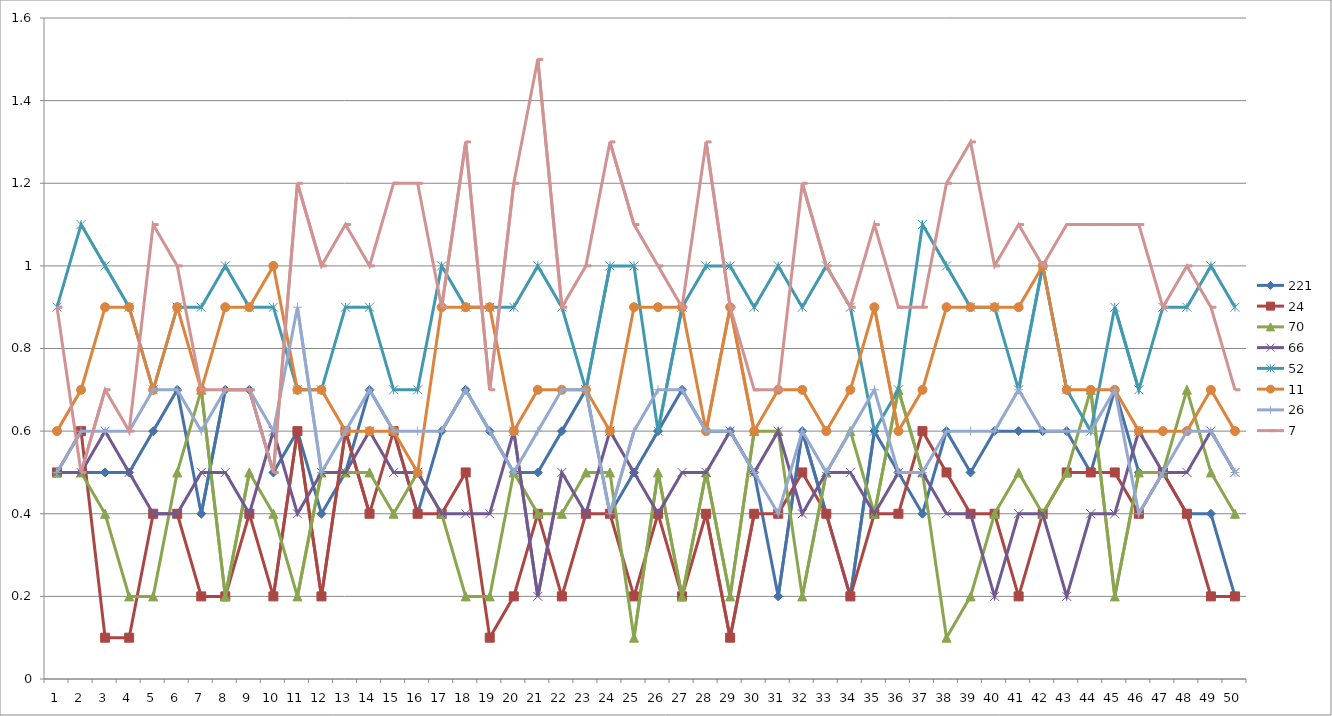
| Category | 221 | 24 | 70 | 66 | 52 | 11 | 26 | 7 |
|---|---|---|---|---|---|---|---|---|
| 0 | 0.5 | 0.5 | 0.5 | 0.5 | 0.9 | 0.6 | 0.5 | 0.9 |
| 1 | 0.5 | 0.6 | 0.5 | 0.5 | 1.1 | 0.7 | 0.6 | 0.5 |
| 2 | 0.5 | 0.1 | 0.4 | 0.6 | 1 | 0.9 | 0.6 | 0.7 |
| 3 | 0.5 | 0.1 | 0.2 | 0.5 | 0.9 | 0.9 | 0.6 | 0.6 |
| 4 | 0.6 | 0.4 | 0.2 | 0.4 | 0.7 | 0.7 | 0.7 | 1.1 |
| 5 | 0.7 | 0.4 | 0.5 | 0.4 | 0.9 | 0.9 | 0.7 | 1 |
| 6 | 0.4 | 0.2 | 0.7 | 0.5 | 0.9 | 0.7 | 0.6 | 0.7 |
| 7 | 0.7 | 0.2 | 0.2 | 0.5 | 1 | 0.9 | 0.7 | 0.7 |
| 8 | 0.7 | 0.4 | 0.5 | 0.4 | 0.9 | 0.9 | 0.7 | 0.7 |
| 9 | 0.5 | 0.2 | 0.4 | 0.6 | 0.9 | 1 | 0.6 | 0.5 |
| 10 | 0.6 | 0.6 | 0.2 | 0.4 | 0.7 | 0.7 | 0.9 | 1.2 |
| 11 | 0.4 | 0.2 | 0.5 | 0.5 | 0.7 | 0.7 | 0.5 | 1 |
| 12 | 0.5 | 0.6 | 0.5 | 0.5 | 0.9 | 0.6 | 0.6 | 1.1 |
| 13 | 0.7 | 0.4 | 0.5 | 0.6 | 0.9 | 0.6 | 0.7 | 1 |
| 14 | 0.6 | 0.6 | 0.4 | 0.5 | 0.7 | 0.6 | 0.6 | 1.2 |
| 15 | 0.4 | 0.4 | 0.5 | 0.5 | 0.7 | 0.5 | 0.6 | 1.2 |
| 16 | 0.6 | 0.4 | 0.4 | 0.4 | 1 | 0.9 | 0.6 | 0.9 |
| 17 | 0.7 | 0.5 | 0.2 | 0.4 | 0.9 | 0.9 | 0.7 | 1.3 |
| 18 | 0.6 | 0.1 | 0.2 | 0.4 | 0.9 | 0.9 | 0.6 | 0.7 |
| 19 | 0.5 | 0.2 | 0.5 | 0.6 | 0.9 | 0.6 | 0.5 | 1.2 |
| 20 | 0.5 | 0.4 | 0.4 | 0.2 | 1 | 0.7 | 0.6 | 1.5 |
| 21 | 0.6 | 0.2 | 0.4 | 0.5 | 0.9 | 0.7 | 0.7 | 0.9 |
| 22 | 0.7 | 0.4 | 0.5 | 0.4 | 0.7 | 0.7 | 0.7 | 1 |
| 23 | 0.4 | 0.4 | 0.5 | 0.6 | 1 | 0.6 | 0.4 | 1.3 |
| 24 | 0.5 | 0.2 | 0.1 | 0.5 | 1 | 0.9 | 0.6 | 1.1 |
| 25 | 0.6 | 0.4 | 0.5 | 0.4 | 0.6 | 0.9 | 0.7 | 1 |
| 26 | 0.7 | 0.2 | 0.2 | 0.5 | 0.9 | 0.9 | 0.7 | 0.9 |
| 27 | 0.6 | 0.4 | 0.5 | 0.5 | 1 | 0.6 | 0.6 | 1.3 |
| 28 | 0.6 | 0.1 | 0.2 | 0.6 | 1 | 0.9 | 0.6 | 0.9 |
| 29 | 0.5 | 0.4 | 0.6 | 0.5 | 0.9 | 0.6 | 0.5 | 0.7 |
| 30 | 0.2 | 0.4 | 0.6 | 0.6 | 1 | 0.7 | 0.4 | 0.7 |
| 31 | 0.6 | 0.5 | 0.2 | 0.4 | 0.9 | 0.7 | 0.6 | 1.2 |
| 32 | 0.4 | 0.4 | 0.5 | 0.5 | 1 | 0.6 | 0.5 | 1 |
| 33 | 0.2 | 0.2 | 0.6 | 0.5 | 0.9 | 0.7 | 0.6 | 0.9 |
| 34 | 0.6 | 0.4 | 0.4 | 0.4 | 0.6 | 0.9 | 0.7 | 1.1 |
| 35 | 0.5 | 0.4 | 0.7 | 0.5 | 0.7 | 0.6 | 0.5 | 0.9 |
| 36 | 0.4 | 0.6 | 0.5 | 0.5 | 1.1 | 0.7 | 0.5 | 0.9 |
| 37 | 0.6 | 0.5 | 0.1 | 0.4 | 1 | 0.9 | 0.6 | 1.2 |
| 38 | 0.5 | 0.4 | 0.2 | 0.4 | 0.9 | 0.9 | 0.6 | 1.3 |
| 39 | 0.6 | 0.4 | 0.4 | 0.2 | 0.9 | 0.9 | 0.6 | 1 |
| 40 | 0.6 | 0.2 | 0.5 | 0.4 | 0.7 | 0.9 | 0.7 | 1.1 |
| 41 | 0.6 | 0.4 | 0.4 | 0.4 | 1 | 1 | 0.6 | 1 |
| 42 | 0.6 | 0.5 | 0.5 | 0.2 | 0.7 | 0.7 | 0.6 | 1.1 |
| 43 | 0.5 | 0.5 | 0.7 | 0.4 | 0.6 | 0.7 | 0.6 | 1.1 |
| 44 | 0.7 | 0.5 | 0.2 | 0.4 | 0.9 | 0.7 | 0.7 | 1.1 |
| 45 | 0.5 | 0.4 | 0.5 | 0.6 | 0.7 | 0.6 | 0.4 | 1.1 |
| 46 | 0.5 | 0.5 | 0.5 | 0.5 | 0.9 | 0.6 | 0.5 | 0.9 |
| 47 | 0.4 | 0.4 | 0.7 | 0.5 | 0.9 | 0.6 | 0.6 | 1 |
| 48 | 0.4 | 0.2 | 0.5 | 0.6 | 1 | 0.7 | 0.6 | 0.9 |
| 49 | 0.2 | 0.2 | 0.4 | 0.5 | 0.9 | 0.6 | 0.5 | 0.7 |